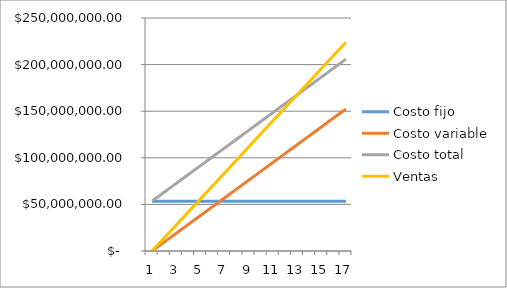
| Category | Costo fijo | Costo variable | Costo total | Ventas |
|---|---|---|---|---|
| 0 | 53487176.892 | 0 | 53487176.892 | 0 |
| 1 | 53487176.892 | 9525471.677 | 63012648.569 | 14000000 |
| 2 | 53487176.892 | 19050943.354 | 72538120.247 | 28000000 |
| 3 | 53487176.892 | 28576415.032 | 82063591.924 | 42000000 |
| 4 | 53487176.892 | 38101886.709 | 91589063.601 | 56000000 |
| 5 | 53487176.892 | 47627358.386 | 101114535.278 | 70000000 |
| 6 | 53487176.892 | 57152830.063 | 110640006.956 | 84000000 |
| 7 | 53487176.892 | 66678301.74 | 120165478.633 | 98000000 |
| 8 | 53487176.892 | 76203773.418 | 129690950.31 | 112000000 |
| 9 | 53487176.892 | 85729245.095 | 139216421.987 | 126000000 |
| 10 | 53487176.892 | 95254716.772 | 148741893.664 | 140000000 |
| 11 | 53487176.892 | 104780188.449 | 158267365.342 | 154000000 |
| 12 | 53487176.892 | 114305660.127 | 167792837.019 | 168000000 |
| 13 | 53487176.892 | 123831131.804 | 177318308.696 | 182000000 |
| 14 | 53487176.892 | 133356603.481 | 186843780.373 | 196000000 |
| 15 | 53487176.892 | 142882075.158 | 196369252.05 | 210000000 |
| 16 | 53487176.892 | 152407546.835 | 205894723.728 | 224000000 |